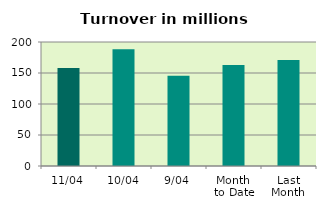
| Category | Series 0 |
|---|---|
| 11/04 | 158.252 |
| 10/04 | 188.247 |
| 9/04 | 145.44 |
| Month 
to Date | 163.044 |
| Last
Month | 171.15 |